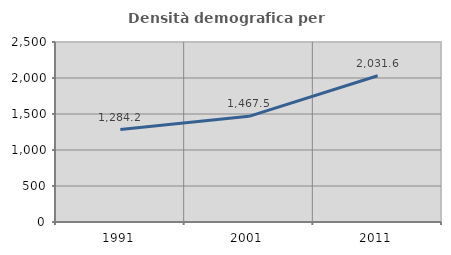
| Category | Densità demografica |
|---|---|
| 1991.0 | 1284.183 |
| 2001.0 | 1467.489 |
| 2011.0 | 2031.586 |